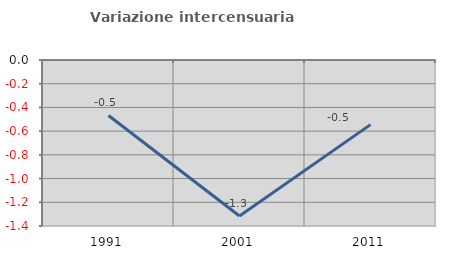
| Category | Variazione intercensuaria annua |
|---|---|
| 1991.0 | -0.468 |
| 2001.0 | -1.315 |
| 2011.0 | -0.545 |